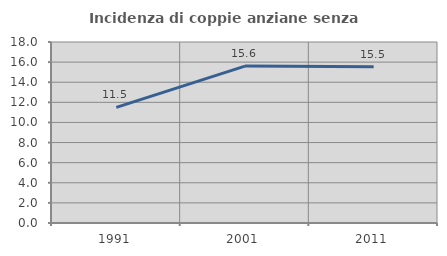
| Category | Incidenza di coppie anziane senza figli  |
|---|---|
| 1991.0 | 11.494 |
| 2001.0 | 15.607 |
| 2011.0 | 15.549 |